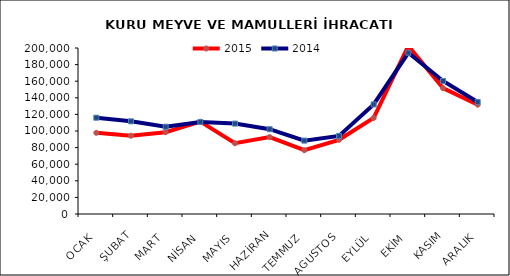
| Category | 2015 | 2014 |
|---|---|---|
| OCAK | 97812.898 | 116015.179 |
| ŞUBAT | 94328.584 | 111650.12 |
| MART | 98548.828 | 105104.488 |
| NİSAN | 111251.076 | 110829.803 |
| MAYIS | 85220.711 | 108918.629 |
| HAZİRAN | 92626.931 | 102138.389 |
| TEMMUZ | 76814.647 | 88391.264 |
| AGUSTOS | 89395.296 | 94078.27 |
| EYLÜL | 115694.378 | 132058.66 |
| EKİM | 202561.299 | 194232.339 |
| KASIM | 151694.082 | 160259.995 |
| ARALIK | 131691.792 | 134964.881 |